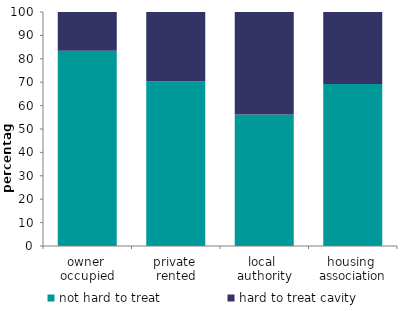
| Category | not hard to treat | hard to treat cavity |
|---|---|---|
| owner 
occupied | 83.489 | 16.511 |
| private 
rented | 70.325 | 29.675 |
| local 
authority | 56.246 | 43.754 |
| housing 
association | 69.212 | 30.788 |